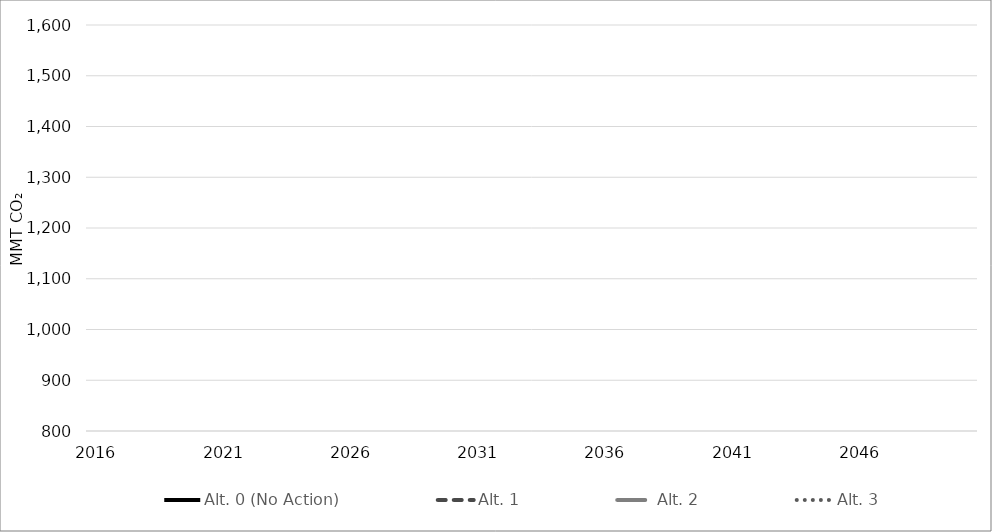
| Category | Alt. 0 (No Action) | Alt. 1 | Alt. 2 | Alt. 3 |
|---|---|---|---|---|
| 2016.0 | 193.479 | 193.479 | 193.479 | 193.479 |
| 2017.0 | 192.435 | 192.435 | 192.435 | 192.435 |
| 2018.0 | 191.39 | 191.39 | 191.39 | 191.39 |
| 2019.0 | 190.345 | 190.345 | 190.345 | 190.345 |
| 2020.0 | 189.301 | 189.301 | 189.301 | 189.301 |
| 2021.0 | 188.256 | 188.256 | 188.256 | 188.256 |
| 2022.0 | 186.311 | 186.311 | 186.311 | 186.311 |
| 2023.0 | 185.738 | 185.738 | 185.738 | 185.738 |
| 2024.0 | 183.938 | 183.938 | 183.938 | 183.938 |
| 2025.0 | 183.389 | 183.389 | 183.389 | 183.389 |
| 2026.0 | 183.412 | 183.412 | 183.412 | 183.412 |
| 2027.0 | 183.345 | 183.345 | 183.345 | 183.345 |
| 2028.0 | 182.85 | 182.85 | 182.85 | 182.85 |
| 2029.0 | 182.907 | 182.907 | 182.907 | 182.907 |
| 2030.0 | 180.18 | 180.177 | 180.171 | 180.161 |
| 2031.0 | 176.631 | 176.627 | 176.609 | 176.285 |
| 2032.0 | 173.176 | 173.169 | 173.14 | 172.541 |
| 2033.0 | 168.914 | 168.903 | 168.707 | 167.66 |
| 2034.0 | 164.89 | 164.873 | 164.522 | 163.064 |
| 2035.0 | 161.361 | 161.34 | 160.841 | 158.778 |
| 2036.0 | 157.484 | 157.46 | 156.802 | 154.171 |
| 2037.0 | 153.761 | 153.733 | 152.926 | 149.715 |
| 2038.0 | 150.391 | 150.36 | 149.413 | 145.659 |
| 2039.0 | 147.38 | 147.348 | 146.283 | 142.005 |
| 2040.0 | 144.669 | 144.633 | 143.469 | 138.696 |
| 2041.0 | 142.303 | 142.259 | 140.997 | 135.855 |
| 2042.0 | 140.232 | 140.182 | 138.83 | 133.332 |
| 2043.0 | 137.974 | 137.915 | 136.486 | 130.897 |
| 2044.0 | 136.01 | 135.943 | 134.443 | 128.765 |
| 2045.0 | 134.292 | 134.219 | 132.653 | 126.923 |
| 2046.0 | 132.727 | 132.647 | 131.025 | 125.259 |
| 2047.0 | 130.669 | 130.588 | 128.919 | 123.287 |
| 2048.0 | 128.821 | 128.74 | 127.026 | 121.511 |
| 2049.0 | 127.02 | 126.941 | 125.192 | 119.926 |
| 2050.0 | 125.297 | 125.221 | 123.443 | 118.417 |